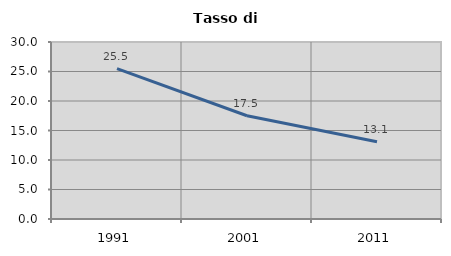
| Category | Tasso di disoccupazione   |
|---|---|
| 1991.0 | 25.474 |
| 2001.0 | 17.502 |
| 2011.0 | 13.081 |